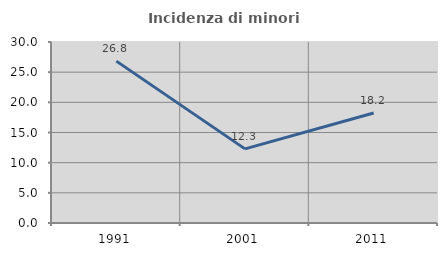
| Category | Incidenza di minori stranieri |
|---|---|
| 1991.0 | 26.829 |
| 2001.0 | 12.288 |
| 2011.0 | 18.243 |